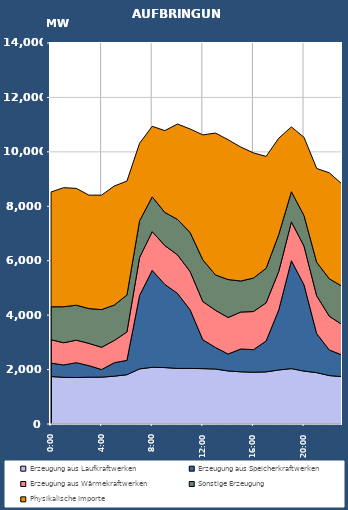
| Category | Erzeugung aus Laufkraftwerken | Erzeugung aus Speicherkraftwerken | Erzeugung aus Wärmekraftwerken | Sonstige Erzeugung | Physikalische Importe |
|---|---|---|---|---|---|
| 2007-01-17 | 1744.053 | 493.939 | 859.205 | 1210.68 | 4216.562 |
| 2007-01-17 01:00:00 | 1716.043 | 453.811 | 815.529 | 1323.498 | 4375.274 |
| 2007-01-17 02:00:00 | 1707.674 | 545.601 | 826.813 | 1286.629 | 4291.982 |
| 2007-01-17 03:00:00 | 1720.168 | 423.605 | 817.461 | 1279.703 | 4168.998 |
| 2007-01-17 04:00:00 | 1721.328 | 279.819 | 817.631 | 1385.596 | 4206.174 |
| 2007-01-17 05:00:00 | 1757.354 | 494.253 | 816.342 | 1303.405 | 4373.274 |
| 2007-01-17 06:00:00 | 1811.216 | 527.827 | 1042.161 | 1356.852 | 4186.958 |
| 2007-01-17 07:00:00 | 2025.302 | 2697.605 | 1394.391 | 1349.299 | 2849.582 |
| 2007-01-17 08:00:00 | 2083.445 | 3560.657 | 1424.261 | 1277.754 | 2593.002 |
| 2007-01-17 09:00:00 | 2073.319 | 3055.861 | 1426.978 | 1217.306 | 3007.662 |
| 2007-01-17 10:00:00 | 2041.681 | 2756.287 | 1417.238 | 1301.736 | 3505.21 |
| 2007-01-17 11:00:00 | 2042.441 | 2150.24 | 1406.498 | 1433.415 | 3807.575 |
| 2007-01-17 12:00:00 | 2034.667 | 1060.719 | 1405.763 | 1533.614 | 4589.009 |
| 2007-01-17 13:00:00 | 2019.655 | 792.139 | 1365.832 | 1301.159 | 5212.331 |
| 2007-01-17 14:00:00 | 1948.733 | 621.747 | 1342.715 | 1394.804 | 5137.134 |
| 2007-01-17 15:00:00 | 1917.716 | 839.145 | 1357.898 | 1138.84 | 4923.152 |
| 2007-01-17 16:00:00 | 1903.186 | 827.333 | 1401.949 | 1230.843 | 4599.588 |
| 2007-01-17 17:00:00 | 1915.248 | 1132.415 | 1404.145 | 1269.54 | 4110.422 |
| 2007-01-17 18:00:00 | 1985.852 | 2204.907 | 1415.195 | 1356.579 | 3539.982 |
| 2007-01-17 19:00:00 | 2034.75 | 3966.953 | 1425.324 | 1107.103 | 2382.242 |
| 2007-01-17 20:00:00 | 1944.358 | 3167.773 | 1423.943 | 1123.402 | 2871.182 |
| 2007-01-17 21:00:00 | 1886.627 | 1433.233 | 1391.246 | 1231.604 | 3448.382 |
| 2007-01-17 22:00:00 | 1779.199 | 938.924 | 1240.254 | 1378.066 | 3891.982 |
| 2007-01-17 23:00:00 | 1740.787 | 796.932 | 1118.624 | 1405.256 | 3755.502 |